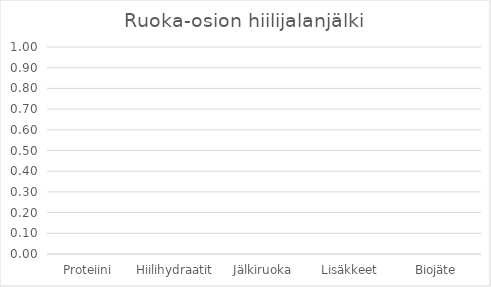
| Category | Liikenne-osion hiilijalanjälki |
|---|---|
| Auto | 0 |
| Muu ajoneuvo | 0 |
| Julkinen | 0 |
| Muut | 0 |
| Reissut | 0 |